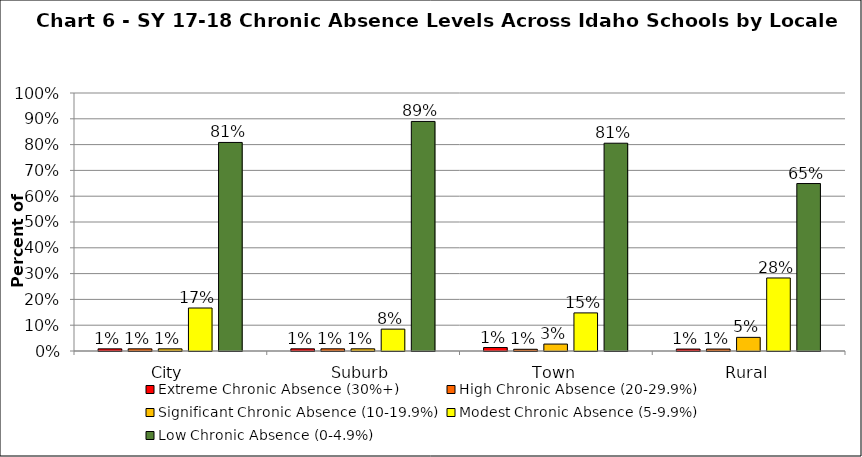
| Category | Extreme Chronic Absence (30%+) | High Chronic Absence (20-29.9%) | Significant Chronic Absence (10-19.9%) | Modest Chronic Absence (5-9.9%) | Low Chronic Absence (0-4.9%) |
|---|---|---|---|---|---|
| 0 | 0.008 | 0.008 | 0.008 | 0.167 | 0.808 |
| 1 | 0.008 | 0.008 | 0.008 | 0.085 | 0.89 |
| 2 | 0.013 | 0.007 | 0.027 | 0.148 | 0.805 |
| 3 | 0.008 | 0.008 | 0.053 | 0.283 | 0.649 |